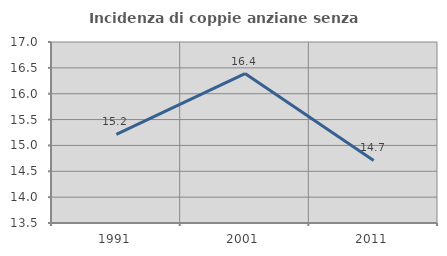
| Category | Incidenza di coppie anziane senza figli  |
|---|---|
| 1991.0 | 15.215 |
| 2001.0 | 16.39 |
| 2011.0 | 14.71 |